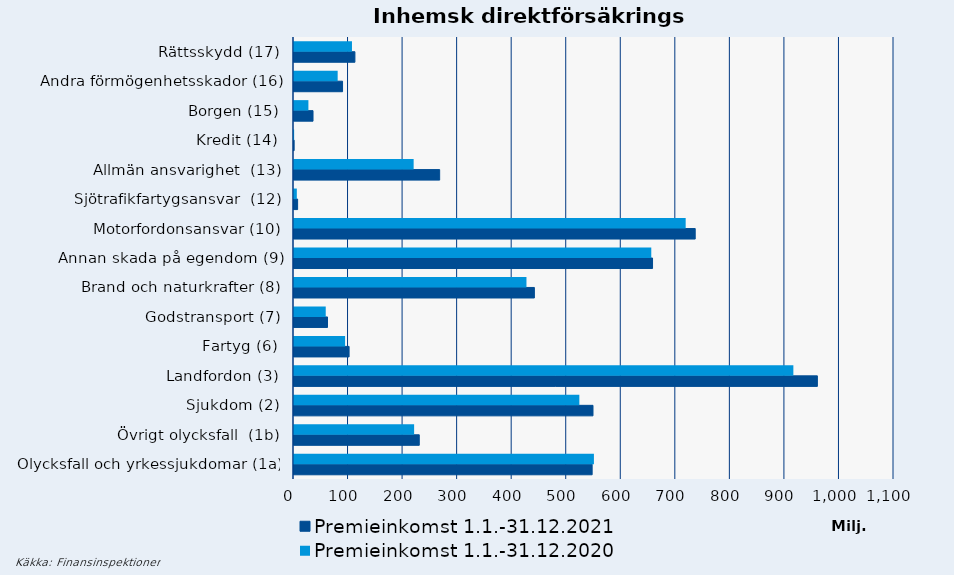
| Category | Premieinkomst |
|---|---|
| Olycksfall och yrkessjukdomar (1a) | 549843.422 |
| Övrigt olycksfall  (1b) | 220226.856 |
| Sjukdom (2) | 523129.933 |
| Landfordon (3) | 915498.982 |
| Fartyg (6) | 93668.316 |
| Godstransport (7) | 58177.492 |
| Brand och naturkrafter (8) | 426182.783 |
| Annan skada på egendom (9) | 655020.47 |
| Motorfordonsansvar (10) | 718074.556 |
| Sjötrafikfartygsansvar  (12) | 5170.486 |
| Allmän ansvarighet  (13) | 219343.744 |
| Kredit (14) | 250.786 |
| Borgen (15) | 26408.731 |
| Andra förmögenhetsskador (16) | 80054.151 |
| Rättsskydd (17) | 106279.304 |